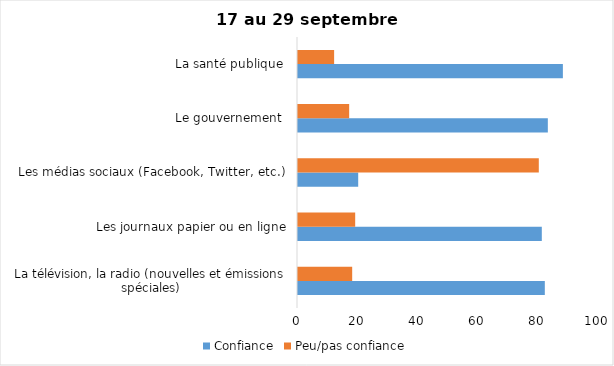
| Category | Confiance | Peu/pas confiance |
|---|---|---|
| La télévision, la radio (nouvelles et émissions spéciales) | 82 | 18 |
| Les journaux papier ou en ligne | 81 | 19 |
| Les médias sociaux (Facebook, Twitter, etc.) | 20 | 80 |
| Le gouvernement  | 83 | 17 |
| La santé publique  | 88 | 12 |